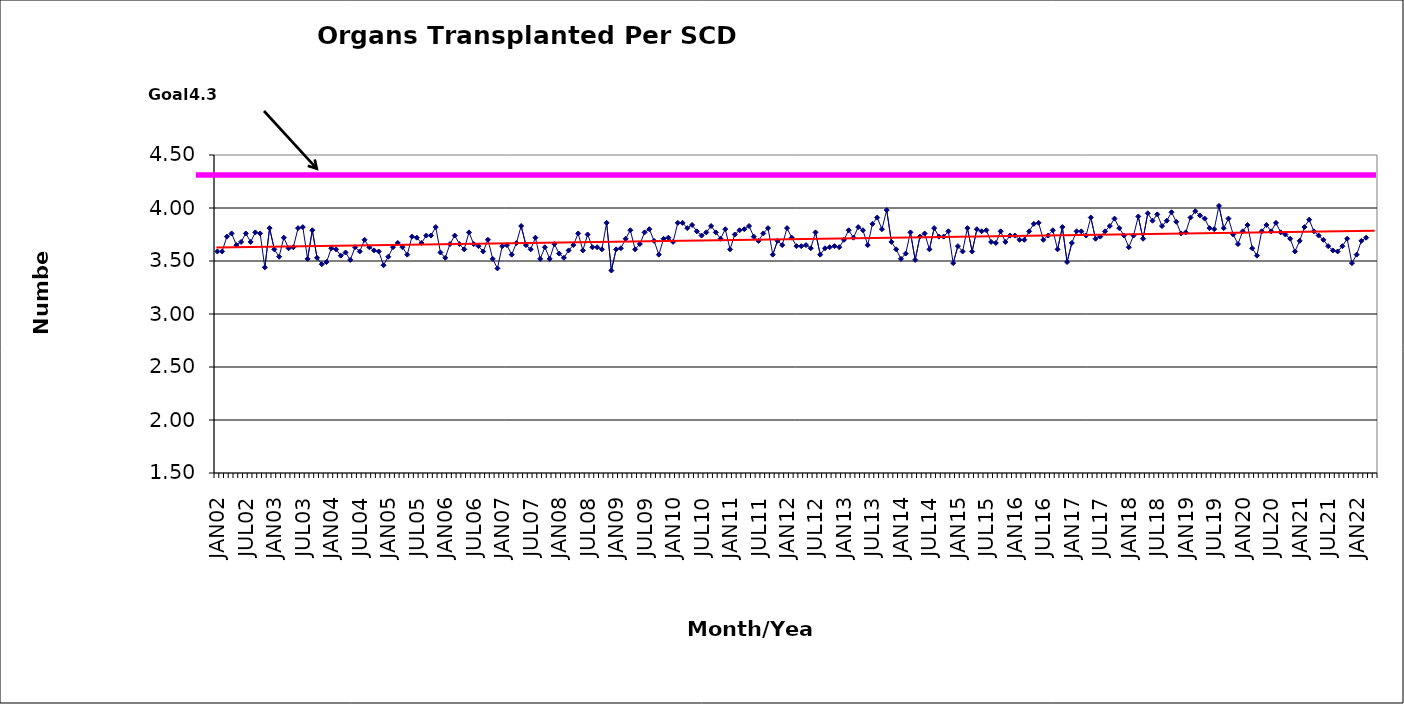
| Category | Series 0 |
|---|---|
| JAN02 | 3.59 |
| FEB02 | 3.59 |
| MAR02 | 3.73 |
| APR02 | 3.76 |
| MAY02 | 3.65 |
| JUN02 | 3.68 |
| JUL02 | 3.76 |
| AUG02 | 3.68 |
| SEP02 | 3.77 |
| OCT02 | 3.76 |
| NOV02 | 3.44 |
| DEC02 | 3.81 |
| JAN03 | 3.61 |
| FEB03 | 3.54 |
| MAR03 | 3.72 |
| APR03 | 3.62 |
| MAY03 | 3.63 |
| JUN03 | 3.81 |
| JUL03 | 3.82 |
| AUG03 | 3.52 |
| SEP03 | 3.79 |
| OCT03 | 3.53 |
| NOV03 | 3.47 |
| DEC03 | 3.49 |
| JAN04 | 3.62 |
| FEB04 | 3.61 |
| MAR04 | 3.55 |
| APR04 | 3.58 |
| MAY04 | 3.51 |
| JUN04 | 3.63 |
| JUL04 | 3.59 |
| AUG04 | 3.7 |
| SEP04 | 3.63 |
| OCT04 | 3.6 |
| NOV04 | 3.59 |
| DEC04 | 3.46 |
| JAN05 | 3.54 |
| FEB05 | 3.63 |
| MAR05 | 3.67 |
| APR05 | 3.63 |
| MAY05 | 3.56 |
| JUN05 | 3.73 |
| JUL05 | 3.72 |
| AUG05 | 3.67 |
| SEP05 | 3.74 |
| OCT05 | 3.74 |
| NOV05 | 3.82 |
| DEC05 | 3.58 |
| JAN06 | 3.53 |
| FEB06 | 3.66 |
| MAR06 | 3.74 |
| APR06 | 3.66 |
| MAY06 | 3.61 |
| JUN06 | 3.77 |
| JUL06 | 3.66 |
| AUG06 | 3.64 |
| SEP06 | 3.59 |
| OCT06 | 3.7 |
| NOV06 | 3.52 |
| DEC06 | 3.43 |
| JAN07 | 3.64 |
| FEB07 | 3.65 |
| MAR07 | 3.56 |
| APR07 | 3.67 |
| MAY07 | 3.83 |
| JUN07 | 3.65 |
| JUL07 | 3.61 |
| AUG07 | 3.72 |
| SEP07 | 3.52 |
| OCT07 | 3.63 |
| NOV07 | 3.52 |
| DEC07 | 3.66 |
| JAN08 | 3.57 |
| FEB08 | 3.53 |
| MAR08 | 3.6 |
| APR08 | 3.65 |
| MAY08 | 3.76 |
| JUN08 | 3.6 |
| JUL08 | 3.75 |
| AUG08 | 3.63 |
| SEP08 | 3.63 |
| OCT08 | 3.61 |
| NOV08 | 3.86 |
| DEC08 | 3.41 |
| JAN09 | 3.61 |
| FEB09 | 3.62 |
| MAR09 | 3.71 |
| APR09 | 3.79 |
| MAY09 | 3.61 |
| JUN09 | 3.66 |
| JUL09 | 3.77 |
| AUG09 | 3.8 |
| SEP09 | 3.69 |
| OCT09 | 3.56 |
| NOV09 | 3.71 |
| DEC09 | 3.72 |
| JAN10 | 3.68 |
| FEB10 | 3.86 |
| MAR10 | 3.86 |
| APR10 | 3.81 |
| MAY10 | 3.84 |
| JUN10 | 3.78 |
| JUL10 | 3.74 |
| AUG10 | 3.77 |
| SEP10 | 3.83 |
| OCT10 | 3.77 |
| NOV10 | 3.71 |
| DEC10 | 3.8 |
| JAN11 | 3.61 |
| FEB11 | 3.75 |
| MAR11 | 3.79 |
| APR11 | 3.8 |
| MAY11 | 3.83 |
| JUN11 | 3.73 |
| JUL11 | 3.69 |
| AUG11 | 3.76 |
| SEP11 | 3.81 |
| OCT11 | 3.56 |
| NOV11 | 3.69 |
| DEC11 | 3.65 |
| JAN12 | 3.81 |
| FEB12 | 3.72 |
| MAR12 | 3.64 |
| APR12 | 3.64 |
| MAY12 | 3.65 |
| JUN12 | 3.62 |
| JUL12 | 3.77 |
| AUG12 | 3.56 |
| SEP12 | 3.62 |
| OCT12 | 3.63 |
| NOV12 | 3.64 |
| DEC12 | 3.63 |
| JAN13 | 3.7 |
| FEB13 | 3.79 |
| MAR13 | 3.72 |
| APR13 | 3.82 |
| MAY13 | 3.79 |
| JUN13 | 3.65 |
| JUL13 | 3.85 |
| AUG13 | 3.91 |
| SEP13 | 3.8 |
| OCT13 | 3.98 |
| NOV13 | 3.68 |
| DEC13 | 3.61 |
| JAN14 | 3.52 |
| FEB14 | 3.57 |
| MAR14 | 3.77 |
| APR14 | 3.51 |
| MAY14 | 3.73 |
| JUN14 | 3.76 |
| JUL14 | 3.61 |
| AUG14 | 3.81 |
| SEP14 | 3.73 |
| OCT14 | 3.73 |
| NOV14 | 3.78 |
| DEC14 | 3.48 |
| JAN15 | 3.64 |
| FEB15 | 3.59 |
| MAR15 | 3.81 |
| APR15 | 3.59 |
| MAY15 | 3.8 |
| JUN15 | 3.78 |
| JUL15 | 3.79 |
| AUG15 | 3.68 |
| SEP15 | 3.67 |
| OCT15 | 3.78 |
| NOV15 | 3.68 |
| DEC15 | 3.74 |
| JAN16 | 3.74 |
| FEB16 | 3.7 |
| MAR16 | 3.7 |
| APR16 | 3.78 |
| MAY16 | 3.85 |
| JUN16 | 3.86 |
| JUL16 | 3.7 |
| AUG16 | 3.74 |
| SEP16 | 3.79 |
| OCT16 | 3.61 |
| NOV16 | 3.82 |
| DEC16 | 3.49 |
| JAN17 | 3.67 |
| FEB17 | 3.78 |
| MAR17 | 3.78 |
| APR17 | 3.74 |
| MAY17 | 3.91 |
| JUN17 | 3.71 |
| JUL17 | 3.73 |
| AUG17 | 3.78 |
| SEP17 | 3.83 |
| OCT17 | 3.9 |
| NOV17 | 3.81 |
| DEC17 | 3.74 |
| JAN18 | 3.63 |
| FEB18 | 3.74 |
| MAR18 | 3.92 |
| APR18 | 3.71 |
| MAY18 | 3.95 |
| JUN18 | 3.88 |
| JUL18 | 3.94 |
| AUG18 | 3.83 |
| SEP18 | 3.88 |
| OCT18 | 3.96 |
| NOV18 | 3.87 |
| DEC18 | 3.76 |
| JAN19 | 3.77 |
| FEB19 | 3.91 |
| MAR19 | 3.97 |
| APR19 | 3.93 |
| MAY19 | 3.9 |
| JUN19 | 3.81 |
| JUL19 | 3.8 |
| AUG19 | 4.02 |
| SEP19 | 3.81 |
| OCT19 | 3.9 |
| NOV19 | 3.75 |
| DEC19 | 3.66 |
| JAN20 | 3.78 |
| FEB20 | 3.84 |
| MAR20 | 3.62 |
| APR20 | 3.55 |
| MAY20 | 3.78 |
| JUN20 | 3.84 |
| JUL20 | 3.78 |
| AUG20 | 3.86 |
| SEP20 | 3.77 |
| OCT20 | 3.75 |
| NOV20 | 3.71 |
| DEC20 | 3.59 |
| JAN21 | 3.69 |
| FEB21 | 3.82 |
| MAR21 | 3.89 |
| APR21 | 3.78 |
| MAY21 | 3.74 |
| JUN21 | 3.7 |
| JUL21 | 3.64 |
| AUG21 | 3.6 |
| SEP21 | 3.59 |
| OCT21 | 3.64 |
| NOV21 | 3.71 |
| DEC21 | 3.48 |
| JAN22 | 3.56 |
| FEB22 | 3.69 |
| MAR22 | 3.72 |